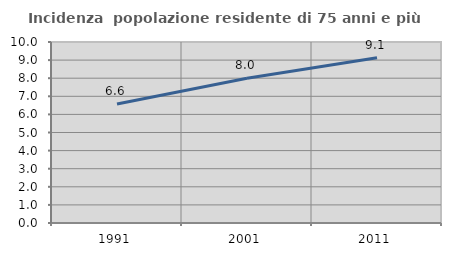
| Category | Incidenza  popolazione residente di 75 anni e più |
|---|---|
| 1991.0 | 6.578 |
| 2001.0 | 7.995 |
| 2011.0 | 9.134 |